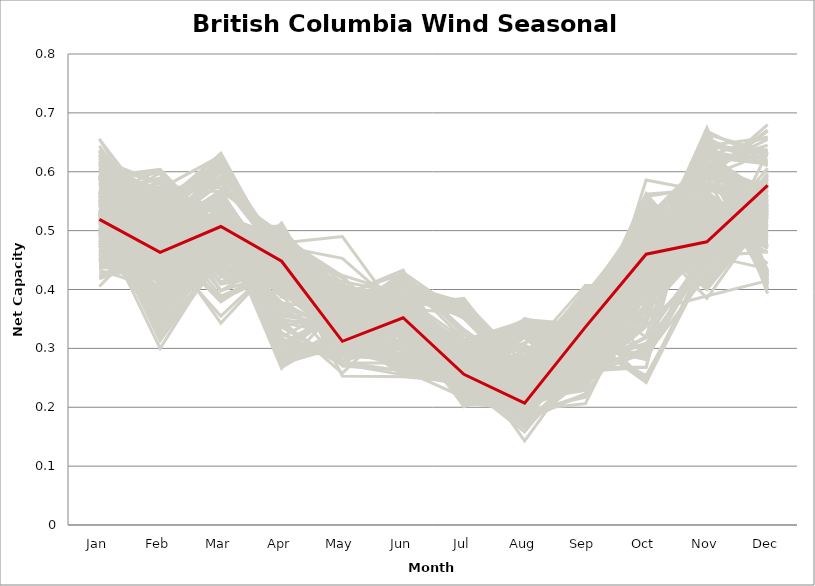
| Category | sample_001 | sample_002 | sample_003 | sample_004 | sample_005 | sample_006 | sample_007 | sample_008 | sample_009 | sample_011 | sample_012 | sample_013 | sample_014 | sample_015 | sample_016 | sample_017 | sample_018 | sample_019 | sample_020 | sample_021 | sample_022 | sample_023 | sample_024 | sample_025 | sample_026 | sample_027 | sample_028 | sample_029 | sample_030 | sample_031 | sample_032 | sample_033 | sample_034 | sample_035 | sample_036 | sample_037 | sample_038 | sample_039 | sample_040 | sample_041 | sample_042 | sample_043 | sample_044 | sample_045 | sample_046 | sample_047 | sample_048 | sample_049 | sample_050 | sample_051 | sample_052 | sample_053 | sample_054 | sample_055 | sample_056 | sample_057 | sample_058 | sample_059 | sample_060 | sample_061 | sample_062 | sample_063 | sample_064 | sample_065 | sample_066 | sample_067 | sample_068 | sample_069 | sample_070 | sample_071 | sample_072 | sample_073 | sample_074 | sample_075 | sample_076 | sample_077 | sample_078 | sample_079 | sample_080 | sample_081 | sample_082 | sample_083 | sample_084 | sample_085 | sample_086 | sample_087 | sample_088 | sample_089 | sample_090 | sample_091 | sample_092 | sample_093 | sample_094 | sample_095 | sample_096 | sample_097 | sample_098 | sample_099 | sample_100 | sample_101 | sample_102 | sample_103 | sample_104 | sample_105 | sample_106 | sample_107 | sample_108 | sample_109 | sample_110 | sample_111 | sample_112 | sample_113 | sample_114 | sample_115 | sample_116 | sample_117 | sample_118 | sample_119 | sample_120 | sample_121 | sample_122 | sample_123 | sample_124 | sample_125 | sample_126 | sample_127 | sample_128 | sample_129 | sample_130 | sample_131 | sample_132 | sample_133 | sample_134 | sample_135 | sample_136 | sample_137 | sample_138 | sample_139 | sample_140 | sample_141 | sample_142 | sample_143 | sample_144 | sample_145 | sample_146 | sample_147 | sample_148 | sample_149 | sample_150 | sample_151 | sample_152 | sample_153 | sample_154 | sample_155 | sample_156 | sample_157 | sample_158 | sample_159 | sample_160 | sample_161 | sample_162 | sample_163 | sample_164 | sample_165 | sample_166 | sample_167 | sample_168 | sample_169 | sample_170 | sample_171 | sample_172 | sample_173 | sample_174 | sample_175 | sample_176 | sample_177 | sample_178 | sample_179 | sample_180 | sample_181 | sample_182 | sample_183 | sample_184 | sample_185 | sample_186 | sample_187 | sample_188 | sample_189 | sample_190 | sample_191 | sample_192 | sample_193 | sample_194 | sample_195 | sample_196 | sample_197 | sample_198 | sample_199 | sample_200 | sample_201 | sample_202 | sample_203 | sample_204 | sample_205 | sample_206 | sample_207 | sample_208 | sample_209 | sample_210 | sample_211 | sample_212 | sample_213 | sample_214 | sample_215 | sample_216 | sample_217 | sample_218 | sample_219 | sample_220 | sample_221 | sample_222 | sample_223 | sample_224 | sample_225 | sample_226 | sample_227 | sample_228 | sample_229 | sample_230 | sample_231 | sample_232 | sample_233 | sample_234 | sample_235 | sample_236 | sample_237 | sample_238 | sample_239 | sample_240 | sample_241 | sample_242 | sample_243 | sample_244 | sample_245 | sample_246 | sample_247 | sample_248 | sample_249 | sample_250 | sample_010 |
|---|---|---|---|---|---|---|---|---|---|---|---|---|---|---|---|---|---|---|---|---|---|---|---|---|---|---|---|---|---|---|---|---|---|---|---|---|---|---|---|---|---|---|---|---|---|---|---|---|---|---|---|---|---|---|---|---|---|---|---|---|---|---|---|---|---|---|---|---|---|---|---|---|---|---|---|---|---|---|---|---|---|---|---|---|---|---|---|---|---|---|---|---|---|---|---|---|---|---|---|---|---|---|---|---|---|---|---|---|---|---|---|---|---|---|---|---|---|---|---|---|---|---|---|---|---|---|---|---|---|---|---|---|---|---|---|---|---|---|---|---|---|---|---|---|---|---|---|---|---|---|---|---|---|---|---|---|---|---|---|---|---|---|---|---|---|---|---|---|---|---|---|---|---|---|---|---|---|---|---|---|---|---|---|---|---|---|---|---|---|---|---|---|---|---|---|---|---|---|---|---|---|---|---|---|---|---|---|---|---|---|---|---|---|---|---|---|---|---|---|---|---|---|---|---|---|---|---|---|---|---|---|---|---|---|---|---|---|---|---|---|---|---|---|---|---|---|---|---|---|---|
| Jan | 0.554 | 0.494 | 0.623 | 0.591 | 0.539 | 0.604 | 0.5 | 0.48 | 0.591 | 0.61 | 0.526 | 0.535 | 0.635 | 0.526 | 0.48 | 0.451 | 0.53 | 0.499 | 0.587 | 0.446 | 0.519 | 0.479 | 0.552 | 0.553 | 0.448 | 0.593 | 0.613 | 0.479 | 0.612 | 0.441 | 0.626 | 0.496 | 0.509 | 0.467 | 0.522 | 0.497 | 0.475 | 0.42 | 0.447 | 0.581 | 0.564 | 0.59 | 0.565 | 0.655 | 0.505 | 0.522 | 0.455 | 0.516 | 0.438 | 0.52 | 0.517 | 0.595 | 0.529 | 0.542 | 0.488 | 0.488 | 0.611 | 0.595 | 0.632 | 0.494 | 0.46 | 0.51 | 0.612 | 0.516 | 0.515 | 0.509 | 0.551 | 0.475 | 0.547 | 0.512 | 0.515 | 0.59 | 0.524 | 0.458 | 0.629 | 0.535 | 0.6 | 0.6 | 0.441 | 0.568 | 0.588 | 0.567 | 0.475 | 0.59 | 0.596 | 0.519 | 0.588 | 0.53 | 0.611 | 0.593 | 0.523 | 0.492 | 0.474 | 0.556 | 0.621 | 0.542 | 0.506 | 0.533 | 0.449 | 0.5 | 0.523 | 0.6 | 0.628 | 0.582 | 0.593 | 0.527 | 0.461 | 0.498 | 0.5 | 0.502 | 0.502 | 0.486 | 0.454 | 0.557 | 0.436 | 0.637 | 0.578 | 0.628 | 0.504 | 0.618 | 0.454 | 0.552 | 0.484 | 0.506 | 0.465 | 0.567 | 0.44 | 0.517 | 0.536 | 0.518 | 0.527 | 0.514 | 0.545 | 0.571 | 0.552 | 0.532 | 0.538 | 0.427 | 0.533 | 0.461 | 0.422 | 0.578 | 0.501 | 0.554 | 0.545 | 0.568 | 0.505 | 0.656 | 0.546 | 0.486 | 0.503 | 0.636 | 0.437 | 0.567 | 0.542 | 0.49 | 0.585 | 0.567 | 0.582 | 0.468 | 0.45 | 0.549 | 0.524 | 0.594 | 0.498 | 0.603 | 0.483 | 0.485 | 0.54 | 0.503 | 0.454 | 0.469 | 0.615 | 0.441 | 0.505 | 0.567 | 0.607 | 0.447 | 0.433 | 0.479 | 0.438 | 0.461 | 0.544 | 0.405 | 0.587 | 0.605 | 0.548 | 0.565 | 0.597 | 0.448 | 0.472 | 0.613 | 0.558 | 0.528 | 0.489 | 0.567 | 0.478 | 0.532 | 0.47 | 0.423 | 0.495 | 0.595 | 0.602 | 0.535 | 0.572 | 0.509 | 0.56 | 0.56 | 0.567 | 0.56 | 0.447 | 0.459 | 0.438 | 0.575 | 0.42 | 0.619 | 0.483 | 0.514 | 0.502 | 0.644 | 0.545 | 0.468 | 0.558 | 0.535 | 0.545 | 0.526 | 0.565 | 0.535 | 0.471 | 0.566 | 0.521 | 0.518 | 0.604 | 0.588 | 0.466 | 0.586 | 0.556 | 0.418 | 0.492 | 0.462 | 0.527 | 0.564 | 0.616 | 0.448 | 0.53 | 0.541 | 0.578 | 0.487 | 0.63 | 0.519 |
| Feb | 0.433 | 0.448 | 0.484 | 0.423 | 0.584 | 0.53 | 0.336 | 0.518 | 0.604 | 0.544 | 0.361 | 0.436 | 0.47 | 0.543 | 0.367 | 0.543 | 0.41 | 0.519 | 0.521 | 0.432 | 0.337 | 0.348 | 0.464 | 0.467 | 0.462 | 0.462 | 0.555 | 0.372 | 0.547 | 0.459 | 0.538 | 0.434 | 0.478 | 0.425 | 0.36 | 0.374 | 0.374 | 0.479 | 0.574 | 0.462 | 0.557 | 0.421 | 0.36 | 0.521 | 0.327 | 0.552 | 0.523 | 0.394 | 0.425 | 0.343 | 0.324 | 0.519 | 0.599 | 0.368 | 0.558 | 0.553 | 0.581 | 0.556 | 0.554 | 0.347 | 0.385 | 0.362 | 0.55 | 0.55 | 0.481 | 0.496 | 0.386 | 0.387 | 0.582 | 0.442 | 0.523 | 0.47 | 0.407 | 0.445 | 0.538 | 0.408 | 0.555 | 0.596 | 0.455 | 0.508 | 0.572 | 0.42 | 0.543 | 0.496 | 0.572 | 0.44 | 0.408 | 0.5 | 0.458 | 0.521 | 0.375 | 0.401 | 0.364 | 0.603 | 0.581 | 0.51 | 0.432 | 0.575 | 0.405 | 0.472 | 0.517 | 0.507 | 0.477 | 0.502 | 0.491 | 0.313 | 0.413 | 0.419 | 0.541 | 0.541 | 0.518 | 0.5 | 0.516 | 0.385 | 0.449 | 0.547 | 0.499 | 0.515 | 0.493 | 0.512 | 0.392 | 0.39 | 0.435 | 0.392 | 0.365 | 0.546 | 0.424 | 0.438 | 0.467 | 0.536 | 0.43 | 0.509 | 0.463 | 0.457 | 0.525 | 0.341 | 0.567 | 0.451 | 0.449 | 0.402 | 0.473 | 0.505 | 0.571 | 0.432 | 0.452 | 0.494 | 0.498 | 0.484 | 0.328 | 0.378 | 0.341 | 0.489 | 0.458 | 0.504 | 0.521 | 0.422 | 0.545 | 0.496 | 0.513 | 0.391 | 0.567 | 0.442 | 0.573 | 0.488 | 0.363 | 0.499 | 0.354 | 0.377 | 0.539 | 0.398 | 0.415 | 0.444 | 0.5 | 0.482 | 0.394 | 0.494 | 0.51 | 0.437 | 0.4 | 0.356 | 0.456 | 0.426 | 0.484 | 0.51 | 0.51 | 0.466 | 0.383 | 0.48 | 0.503 | 0.528 | 0.546 | 0.551 | 0.543 | 0.385 | 0.367 | 0.379 | 0.372 | 0.336 | 0.449 | 0.457 | 0.357 | 0.49 | 0.529 | 0.358 | 0.529 | 0.488 | 0.375 | 0.483 | 0.589 | 0.384 | 0.404 | 0.56 | 0.436 | 0.521 | 0.444 | 0.52 | 0.361 | 0.3 | 0.569 | 0.488 | 0.535 | 0.379 | 0.479 | 0.546 | 0.55 | 0.491 | 0.514 | 0.581 | 0.562 | 0.491 | 0.429 | 0.421 | 0.557 | 0.518 | 0.528 | 0.482 | 0.589 | 0.456 | 0.517 | 0.532 | 0.487 | 0.383 | 0.469 | 0.424 | 0.316 | 0.505 | 0.514 | 0.447 | 0.539 | 0.463 |
| Mar | 0.493 | 0.508 | 0.385 | 0.48 | 0.431 | 0.511 | 0.478 | 0.621 | 0.496 | 0.421 | 0.472 | 0.49 | 0.355 | 0.631 | 0.504 | 0.55 | 0.48 | 0.627 | 0.455 | 0.521 | 0.469 | 0.515 | 0.629 | 0.602 | 0.464 | 0.5 | 0.514 | 0.512 | 0.411 | 0.506 | 0.521 | 0.446 | 0.489 | 0.528 | 0.48 | 0.486 | 0.525 | 0.441 | 0.573 | 0.506 | 0.495 | 0.495 | 0.52 | 0.398 | 0.476 | 0.617 | 0.585 | 0.515 | 0.543 | 0.457 | 0.457 | 0.538 | 0.441 | 0.518 | 0.582 | 0.587 | 0.435 | 0.51 | 0.543 | 0.493 | 0.485 | 0.474 | 0.46 | 0.398 | 0.487 | 0.494 | 0.511 | 0.486 | 0.434 | 0.489 | 0.427 | 0.518 | 0.515 | 0.556 | 0.412 | 0.53 | 0.488 | 0.499 | 0.499 | 0.604 | 0.48 | 0.478 | 0.617 | 0.551 | 0.527 | 0.544 | 0.48 | 0.482 | 0.552 | 0.517 | 0.462 | 0.494 | 0.466 | 0.453 | 0.456 | 0.592 | 0.524 | 0.438 | 0.538 | 0.502 | 0.465 | 0.427 | 0.567 | 0.503 | 0.491 | 0.461 | 0.54 | 0.461 | 0.598 | 0.435 | 0.619 | 0.581 | 0.613 | 0.481 | 0.494 | 0.538 | 0.515 | 0.562 | 0.469 | 0.413 | 0.543 | 0.526 | 0.507 | 0.47 | 0.497 | 0.467 | 0.532 | 0.491 | 0.495 | 0.631 | 0.538 | 0.489 | 0.616 | 0.514 | 0.494 | 0.467 | 0.454 | 0.486 | 0.489 | 0.536 | 0.452 | 0.488 | 0.627 | 0.477 | 0.507 | 0.507 | 0.482 | 0.379 | 0.454 | 0.504 | 0.478 | 0.383 | 0.452 | 0.6 | 0.467 | 0.433 | 0.492 | 0.491 | 0.5 | 0.497 | 0.567 | 0.484 | 0.44 | 0.56 | 0.51 | 0.559 | 0.496 | 0.514 | 0.607 | 0.52 | 0.543 | 0.528 | 0.568 | 0.489 | 0.497 | 0.516 | 0.389 | 0.543 | 0.552 | 0.464 | 0.517 | 0.525 | 0.482 | 0.498 | 0.495 | 0.56 | 0.48 | 0.495 | 0.531 | 0.556 | 0.519 | 0.437 | 0.41 | 0.5 | 0.454 | 0.5 | 0.49 | 0.465 | 0.508 | 0.508 | 0.498 | 0.568 | 0.501 | 0.51 | 0.493 | 0.483 | 0.473 | 0.624 | 0.479 | 0.466 | 0.541 | 0.454 | 0.516 | 0.496 | 0.445 | 0.527 | 0.509 | 0.463 | 0.435 | 0.343 | 0.426 | 0.492 | 0.517 | 0.426 | 0.458 | 0.478 | 0.512 | 0.434 | 0.441 | 0.503 | 0.507 | 0.535 | 0.461 | 0.504 | 0.548 | 0.513 | 0.437 | 0.501 | 0.619 | 0.614 | 0.475 | 0.516 | 0.565 | 0.495 | 0.449 | 0.58 | 0.51 | 0.544 | 0.409 | 0.507 |
| Apr | 0.414 | 0.299 | 0.444 | 0.433 | 0.423 | 0.466 | 0.481 | 0.43 | 0.398 | 0.423 | 0.497 | 0.397 | 0.452 | 0.445 | 0.508 | 0.344 | 0.425 | 0.445 | 0.403 | 0.306 | 0.489 | 0.473 | 0.441 | 0.447 | 0.425 | 0.462 | 0.404 | 0.489 | 0.433 | 0.327 | 0.446 | 0.479 | 0.43 | 0.291 | 0.48 | 0.508 | 0.489 | 0.468 | 0.484 | 0.458 | 0.398 | 0.429 | 0.303 | 0.43 | 0.483 | 0.448 | 0.46 | 0.432 | 0.275 | 0.492 | 0.49 | 0.417 | 0.428 | 0.336 | 0.482 | 0.453 | 0.4 | 0.393 | 0.436 | 0.489 | 0.378 | 0.506 | 0.415 | 0.455 | 0.446 | 0.442 | 0.291 | 0.372 | 0.435 | 0.411 | 0.391 | 0.444 | 0.397 | 0.279 | 0.424 | 0.411 | 0.42 | 0.387 | 0.336 | 0.46 | 0.409 | 0.437 | 0.436 | 0.396 | 0.397 | 0.418 | 0.442 | 0.44 | 0.428 | 0.455 | 0.485 | 0.498 | 0.495 | 0.425 | 0.394 | 0.479 | 0.398 | 0.42 | 0.281 | 0.446 | 0.465 | 0.426 | 0.398 | 0.45 | 0.456 | 0.494 | 0.289 | 0.473 | 0.47 | 0.449 | 0.461 | 0.45 | 0.452 | 0.43 | 0.324 | 0.432 | 0.458 | 0.424 | 0.457 | 0.437 | 0.28 | 0.301 | 0.3 | 0.5 | 0.496 | 0.424 | 0.27 | 0.413 | 0.445 | 0.443 | 0.395 | 0.455 | 0.454 | 0.439 | 0.411 | 0.491 | 0.465 | 0.347 | 0.453 | 0.285 | 0.457 | 0.461 | 0.434 | 0.408 | 0.473 | 0.445 | 0.462 | 0.447 | 0.496 | 0.497 | 0.477 | 0.43 | 0.442 | 0.475 | 0.455 | 0.431 | 0.406 | 0.446 | 0.446 | 0.355 | 0.495 | 0.407 | 0.416 | 0.408 | 0.476 | 0.399 | 0.489 | 0.493 | 0.469 | 0.414 | 0.278 | 0.302 | 0.404 | 0.341 | 0.417 | 0.431 | 0.43 | 0.289 | 0.268 | 0.507 | 0.309 | 0.292 | 0.455 | 0.455 | 0.467 | 0.41 | 0.426 | 0.457 | 0.421 | 0.36 | 0.366 | 0.404 | 0.513 | 0.347 | 0.496 | 0.319 | 0.496 | 0.499 | 0.49 | 0.311 | 0.496 | 0.388 | 0.46 | 0.266 | 0.415 | 0.444 | 0.428 | 0.453 | 0.409 | 0.436 | 0.274 | 0.425 | 0.304 | 0.453 | 0.454 | 0.442 | 0.485 | 0.492 | 0.465 | 0.454 | 0.416 | 0.369 | 0.461 | 0.411 | 0.442 | 0.464 | 0.442 | 0.412 | 0.429 | 0.44 | 0.432 | 0.395 | 0.377 | 0.457 | 0.35 | 0.441 | 0.429 | 0.316 | 0.436 | 0.442 | 0.465 | 0.308 | 0.418 | 0.411 | 0.505 | 0.477 | 0.456 | 0.294 | 0.427 | 0.448 |
| May | 0.374 | 0.293 | 0.307 | 0.31 | 0.352 | 0.349 | 0.351 | 0.359 | 0.385 | 0.314 | 0.344 | 0.371 | 0.311 | 0.372 | 0.3 | 0.323 | 0.308 | 0.367 | 0.324 | 0.292 | 0.353 | 0.317 | 0.397 | 0.402 | 0.295 | 0.401 | 0.372 | 0.322 | 0.313 | 0.272 | 0.353 | 0.49 | 0.386 | 0.296 | 0.331 | 0.312 | 0.312 | 0.309 | 0.334 | 0.4 | 0.369 | 0.329 | 0.361 | 0.306 | 0.355 | 0.367 | 0.337 | 0.314 | 0.323 | 0.348 | 0.352 | 0.346 | 0.357 | 0.366 | 0.325 | 0.334 | 0.352 | 0.371 | 0.391 | 0.423 | 0.325 | 0.33 | 0.359 | 0.253 | 0.378 | 0.311 | 0.368 | 0.332 | 0.355 | 0.368 | 0.27 | 0.398 | 0.312 | 0.324 | 0.309 | 0.318 | 0.364 | 0.391 | 0.276 | 0.39 | 0.366 | 0.301 | 0.368 | 0.343 | 0.365 | 0.314 | 0.307 | 0.388 | 0.362 | 0.393 | 0.348 | 0.314 | 0.335 | 0.352 | 0.362 | 0.381 | 0.315 | 0.367 | 0.325 | 0.318 | 0.319 | 0.324 | 0.368 | 0.413 | 0.406 | 0.383 | 0.304 | 0.453 | 0.316 | 0.276 | 0.37 | 0.326 | 0.348 | 0.309 | 0.279 | 0.39 | 0.424 | 0.358 | 0.375 | 0.319 | 0.315 | 0.369 | 0.291 | 0.327 | 0.3 | 0.348 | 0.322 | 0.37 | 0.357 | 0.371 | 0.318 | 0.332 | 0.398 | 0.406 | 0.355 | 0.339 | 0.346 | 0.258 | 0.372 | 0.302 | 0.311 | 0.393 | 0.358 | 0.369 | 0.337 | 0.375 | 0.377 | 0.326 | 0.402 | 0.313 | 0.345 | 0.312 | 0.3 | 0.375 | 0.321 | 0.299 | 0.378 | 0.371 | 0.335 | 0.34 | 0.326 | 0.378 | 0.368 | 0.343 | 0.322 | 0.352 | 0.311 | 0.297 | 0.364 | 0.32 | 0.336 | 0.3 | 0.363 | 0.274 | 0.309 | 0.356 | 0.305 | 0.314 | 0.327 | 0.323 | 0.296 | 0.298 | 0.383 | 0.308 | 0.396 | 0.366 | 0.309 | 0.383 | 0.344 | 0.331 | 0.319 | 0.348 | 0.334 | 0.344 | 0.324 | 0.375 | 0.305 | 0.392 | 0.322 | 0.294 | 0.411 | 0.356 | 0.346 | 0.376 | 0.367 | 0.378 | 0.307 | 0.389 | 0.406 | 0.32 | 0.304 | 0.288 | 0.297 | 0.378 | 0.319 | 0.352 | 0.419 | 0.378 | 0.273 | 0.285 | 0.374 | 0.334 | 0.394 | 0.378 | 0.354 | 0.395 | 0.356 | 0.342 | 0.275 | 0.341 | 0.316 | 0.313 | 0.365 | 0.398 | 0.327 | 0.394 | 0.363 | 0.288 | 0.358 | 0.355 | 0.381 | 0.366 | 0.364 | 0.297 | 0.384 | 0.377 | 0.38 | 0.289 | 0.311 | 0.312 |
| Jun | 0.357 | 0.276 | 0.297 | 0.349 | 0.363 | 0.426 | 0.338 | 0.354 | 0.393 | 0.305 | 0.34 | 0.336 | 0.271 | 0.366 | 0.327 | 0.289 | 0.347 | 0.355 | 0.308 | 0.283 | 0.347 | 0.329 | 0.368 | 0.361 | 0.388 | 0.368 | 0.411 | 0.329 | 0.302 | 0.345 | 0.424 | 0.348 | 0.328 | 0.279 | 0.329 | 0.335 | 0.331 | 0.373 | 0.321 | 0.386 | 0.383 | 0.352 | 0.351 | 0.297 | 0.346 | 0.356 | 0.363 | 0.349 | 0.261 | 0.365 | 0.348 | 0.408 | 0.367 | 0.351 | 0.355 | 0.372 | 0.329 | 0.399 | 0.427 | 0.317 | 0.347 | 0.325 | 0.323 | 0.252 | 0.326 | 0.341 | 0.358 | 0.353 | 0.365 | 0.34 | 0.263 | 0.384 | 0.361 | 0.271 | 0.302 | 0.352 | 0.399 | 0.397 | 0.342 | 0.363 | 0.389 | 0.344 | 0.349 | 0.419 | 0.408 | 0.343 | 0.339 | 0.333 | 0.4 | 0.372 | 0.339 | 0.345 | 0.335 | 0.377 | 0.325 | 0.347 | 0.37 | 0.348 | 0.263 | 0.332 | 0.35 | 0.297 | 0.421 | 0.394 | 0.384 | 0.35 | 0.276 | 0.363 | 0.373 | 0.262 | 0.343 | 0.358 | 0.362 | 0.339 | 0.305 | 0.433 | 0.392 | 0.415 | 0.321 | 0.297 | 0.278 | 0.361 | 0.277 | 0.339 | 0.343 | 0.386 | 0.255 | 0.336 | 0.344 | 0.366 | 0.342 | 0.334 | 0.351 | 0.387 | 0.328 | 0.334 | 0.327 | 0.357 | 0.344 | 0.279 | 0.38 | 0.396 | 0.371 | 0.338 | 0.334 | 0.414 | 0.317 | 0.268 | 0.343 | 0.332 | 0.34 | 0.279 | 0.388 | 0.362 | 0.35 | 0.268 | 0.388 | 0.408 | 0.429 | 0.357 | 0.327 | 0.34 | 0.352 | 0.406 | 0.327 | 0.416 | 0.344 | 0.343 | 0.356 | 0.334 | 0.255 | 0.298 | 0.386 | 0.376 | 0.353 | 0.416 | 0.278 | 0.287 | 0.258 | 0.333 | 0.329 | 0.278 | 0.305 | 0.34 | 0.385 | 0.393 | 0.333 | 0.391 | 0.396 | 0.306 | 0.284 | 0.308 | 0.338 | 0.353 | 0.339 | 0.35 | 0.329 | 0.351 | 0.32 | 0.316 | 0.319 | 0.42 | 0.418 | 0.354 | 0.383 | 0.329 | 0.342 | 0.38 | 0.381 | 0.336 | 0.271 | 0.28 | 0.282 | 0.417 | 0.383 | 0.423 | 0.324 | 0.35 | 0.255 | 0.288 | 0.346 | 0.36 | 0.406 | 0.357 | 0.366 | 0.313 | 0.429 | 0.357 | 0.275 | 0.324 | 0.335 | 0.356 | 0.327 | 0.395 | 0.301 | 0.386 | 0.371 | 0.327 | 0.349 | 0.364 | 0.32 | 0.366 | 0.408 | 0.348 | 0.338 | 0.349 | 0.409 | 0.292 | 0.311 | 0.352 |
| Jul | 0.261 | 0.232 | 0.255 | 0.214 | 0.282 | 0.332 | 0.27 | 0.222 | 0.276 | 0.246 | 0.263 | 0.203 | 0.276 | 0.223 | 0.212 | 0.239 | 0.201 | 0.229 | 0.237 | 0.259 | 0.263 | 0.234 | 0.214 | 0.239 | 0.302 | 0.359 | 0.272 | 0.247 | 0.26 | 0.23 | 0.217 | 0.301 | 0.214 | 0.236 | 0.253 | 0.232 | 0.228 | 0.307 | 0.226 | 0.378 | 0.277 | 0.209 | 0.269 | 0.256 | 0.26 | 0.225 | 0.23 | 0.222 | 0.237 | 0.265 | 0.266 | 0.21 | 0.302 | 0.308 | 0.231 | 0.23 | 0.222 | 0.265 | 0.239 | 0.288 | 0.312 | 0.251 | 0.223 | 0.243 | 0.269 | 0.272 | 0.284 | 0.313 | 0.314 | 0.206 | 0.217 | 0.358 | 0.219 | 0.24 | 0.245 | 0.231 | 0.291 | 0.278 | 0.233 | 0.21 | 0.27 | 0.214 | 0.234 | 0.21 | 0.264 | 0.245 | 0.215 | 0.228 | 0.227 | 0.385 | 0.269 | 0.23 | 0.253 | 0.306 | 0.218 | 0.224 | 0.21 | 0.281 | 0.255 | 0.256 | 0.253 | 0.235 | 0.22 | 0.369 | 0.377 | 0.275 | 0.239 | 0.287 | 0.233 | 0.246 | 0.232 | 0.245 | 0.218 | 0.225 | 0.243 | 0.242 | 0.357 | 0.208 | 0.251 | 0.253 | 0.25 | 0.287 | 0.24 | 0.255 | 0.22 | 0.29 | 0.256 | 0.206 | 0.209 | 0.224 | 0.235 | 0.255 | 0.228 | 0.364 | 0.27 | 0.268 | 0.295 | 0.231 | 0.213 | 0.239 | 0.309 | 0.381 | 0.226 | 0.206 | 0.288 | 0.351 | 0.238 | 0.279 | 0.3 | 0.226 | 0.264 | 0.268 | 0.315 | 0.216 | 0.252 | 0.245 | 0.278 | 0.365 | 0.322 | 0.315 | 0.234 | 0.218 | 0.314 | 0.209 | 0.229 | 0.212 | 0.22 | 0.205 | 0.229 | 0.216 | 0.239 | 0.249 | 0.22 | 0.237 | 0.216 | 0.328 | 0.267 | 0.249 | 0.243 | 0.25 | 0.236 | 0.24 | 0.261 | 0.235 | 0.38 | 0.224 | 0.226 | 0.366 | 0.203 | 0.237 | 0.239 | 0.228 | 0.294 | 0.3 | 0.258 | 0.292 | 0.216 | 0.295 | 0.263 | 0.227 | 0.299 | 0.214 | 0.315 | 0.286 | 0.3 | 0.229 | 0.226 | 0.212 | 0.295 | 0.217 | 0.246 | 0.239 | 0.26 | 0.368 | 0.307 | 0.225 | 0.288 | 0.275 | 0.247 | 0.278 | 0.291 | 0.315 | 0.372 | 0.307 | 0.304 | 0.283 | 0.357 | 0.298 | 0.242 | 0.26 | 0.249 | 0.238 | 0.212 | 0.352 | 0.253 | 0.375 | 0.293 | 0.242 | 0.218 | 0.222 | 0.238 | 0.278 | 0.222 | 0.209 | 0.288 | 0.23 | 0.378 | 0.243 | 0.262 | 0.256 |
| Aug | 0.239 | 0.287 | 0.233 | 0.222 | 0.336 | 0.259 | 0.289 | 0.275 | 0.285 | 0.236 | 0.278 | 0.226 | 0.21 | 0.256 | 0.332 | 0.168 | 0.24 | 0.272 | 0.261 | 0.237 | 0.268 | 0.34 | 0.277 | 0.266 | 0.22 | 0.237 | 0.32 | 0.344 | 0.238 | 0.191 | 0.193 | 0.264 | 0.241 | 0.277 | 0.269 | 0.319 | 0.328 | 0.225 | 0.269 | 0.239 | 0.326 | 0.226 | 0.231 | 0.222 | 0.283 | 0.261 | 0.263 | 0.211 | 0.246 | 0.265 | 0.285 | 0.21 | 0.327 | 0.243 | 0.267 | 0.248 | 0.236 | 0.28 | 0.178 | 0.259 | 0.247 | 0.296 | 0.253 | 0.182 | 0.23 | 0.201 | 0.224 | 0.248 | 0.334 | 0.228 | 0.186 | 0.241 | 0.211 | 0.231 | 0.229 | 0.214 | 0.336 | 0.275 | 0.192 | 0.263 | 0.279 | 0.233 | 0.269 | 0.212 | 0.302 | 0.212 | 0.236 | 0.226 | 0.208 | 0.253 | 0.282 | 0.327 | 0.31 | 0.318 | 0.252 | 0.258 | 0.202 | 0.348 | 0.249 | 0.199 | 0.231 | 0.251 | 0.211 | 0.244 | 0.244 | 0.248 | 0.284 | 0.262 | 0.257 | 0.18 | 0.258 | 0.265 | 0.27 | 0.244 | 0.223 | 0.186 | 0.249 | 0.195 | 0.233 | 0.241 | 0.267 | 0.244 | 0.273 | 0.288 | 0.335 | 0.327 | 0.228 | 0.228 | 0.226 | 0.264 | 0.202 | 0.248 | 0.269 | 0.252 | 0.206 | 0.273 | 0.232 | 0.199 | 0.233 | 0.29 | 0.22 | 0.243 | 0.276 | 0.217 | 0.143 | 0.246 | 0.218 | 0.229 | 0.231 | 0.342 | 0.285 | 0.229 | 0.225 | 0.269 | 0.228 | 0.225 | 0.348 | 0.254 | 0.273 | 0.244 | 0.268 | 0.228 | 0.346 | 0.204 | 0.351 | 0.206 | 0.349 | 0.332 | 0.265 | 0.205 | 0.247 | 0.226 | 0.202 | 0.2 | 0.214 | 0.263 | 0.234 | 0.233 | 0.235 | 0.296 | 0.205 | 0.283 | 0.22 | 0.206 | 0.273 | 0.206 | 0.252 | 0.241 | 0.214 | 0.168 | 0.165 | 0.252 | 0.25 | 0.239 | 0.309 | 0.248 | 0.329 | 0.242 | 0.173 | 0.202 | 0.284 | 0.212 | 0.258 | 0.253 | 0.349 | 0.215 | 0.25 | 0.271 | 0.297 | 0.231 | 0.263 | 0.158 | 0.223 | 0.247 | 0.224 | 0.199 | 0.265 | 0.27 | 0.179 | 0.211 | 0.347 | 0.263 | 0.253 | 0.344 | 0.323 | 0.226 | 0.263 | 0.306 | 0.175 | 0.23 | 0.201 | 0.215 | 0.266 | 0.257 | 0.173 | 0.229 | 0.33 | 0.195 | 0.27 | 0.278 | 0.23 | 0.232 | 0.211 | 0.205 | 0.243 | 0.263 | 0.248 | 0.28 | 0.237 | 0.207 |
| Sep | 0.323 | 0.294 | 0.245 | 0.361 | 0.268 | 0.398 | 0.407 | 0.34 | 0.289 | 0.236 | 0.373 | 0.369 | 0.268 | 0.312 | 0.34 | 0.276 | 0.368 | 0.308 | 0.277 | 0.344 | 0.383 | 0.346 | 0.267 | 0.262 | 0.289 | 0.359 | 0.258 | 0.329 | 0.26 | 0.405 | 0.217 | 0.279 | 0.304 | 0.279 | 0.368 | 0.343 | 0.333 | 0.264 | 0.379 | 0.388 | 0.234 | 0.375 | 0.325 | 0.247 | 0.395 | 0.306 | 0.392 | 0.343 | 0.333 | 0.377 | 0.392 | 0.239 | 0.253 | 0.3 | 0.357 | 0.383 | 0.259 | 0.254 | 0.223 | 0.266 | 0.301 | 0.348 | 0.268 | 0.361 | 0.287 | 0.329 | 0.307 | 0.286 | 0.258 | 0.345 | 0.404 | 0.38 | 0.328 | 0.358 | 0.247 | 0.342 | 0.231 | 0.295 | 0.397 | 0.283 | 0.287 | 0.346 | 0.359 | 0.243 | 0.271 | 0.35 | 0.356 | 0.299 | 0.253 | 0.29 | 0.365 | 0.341 | 0.35 | 0.234 | 0.261 | 0.299 | 0.327 | 0.273 | 0.335 | 0.327 | 0.318 | 0.256 | 0.232 | 0.351 | 0.347 | 0.346 | 0.282 | 0.276 | 0.386 | 0.303 | 0.303 | 0.374 | 0.371 | 0.37 | 0.379 | 0.222 | 0.37 | 0.206 | 0.297 | 0.258 | 0.315 | 0.308 | 0.303 | 0.353 | 0.349 | 0.238 | 0.356 | 0.345 | 0.331 | 0.302 | 0.349 | 0.308 | 0.274 | 0.371 | 0.313 | 0.38 | 0.293 | 0.4 | 0.324 | 0.294 | 0.287 | 0.38 | 0.359 | 0.366 | 0.285 | 0.396 | 0.279 | 0.251 | 0.35 | 0.345 | 0.358 | 0.242 | 0.279 | 0.282 | 0.316 | 0.39 | 0.228 | 0.403 | 0.4 | 0.301 | 0.388 | 0.364 | 0.243 | 0.235 | 0.322 | 0.232 | 0.34 | 0.344 | 0.3 | 0.33 | 0.329 | 0.342 | 0.238 | 0.406 | 0.34 | 0.37 | 0.254 | 0.342 | 0.352 | 0.361 | 0.381 | 0.287 | 0.288 | 0.289 | 0.312 | 0.247 | 0.379 | 0.39 | 0.229 | 0.25 | 0.261 | 0.264 | 0.306 | 0.294 | 0.354 | 0.309 | 0.341 | 0.342 | 0.313 | 0.368 | 0.256 | 0.241 | 0.381 | 0.34 | 0.235 | 0.293 | 0.355 | 0.272 | 0.304 | 0.372 | 0.316 | 0.284 | 0.363 | 0.397 | 0.278 | 0.242 | 0.282 | 0.362 | 0.311 | 0.258 | 0.276 | 0.297 | 0.394 | 0.264 | 0.237 | 0.285 | 0.383 | 0.245 | 0.31 | 0.346 | 0.346 | 0.347 | 0.255 | 0.319 | 0.266 | 0.384 | 0.275 | 0.393 | 0.343 | 0.371 | 0.297 | 0.31 | 0.229 | 0.327 | 0.369 | 0.304 | 0.389 | 0.28 | 0.26 | 0.336 |
| Oct | 0.362 | 0.511 | 0.394 | 0.482 | 0.455 | 0.464 | 0.408 | 0.521 | 0.41 | 0.348 | 0.413 | 0.459 | 0.459 | 0.516 | 0.495 | 0.309 | 0.52 | 0.526 | 0.362 | 0.415 | 0.401 | 0.515 | 0.546 | 0.544 | 0.455 | 0.404 | 0.418 | 0.5 | 0.342 | 0.375 | 0.391 | 0.491 | 0.449 | 0.504 | 0.421 | 0.476 | 0.498 | 0.458 | 0.511 | 0.416 | 0.434 | 0.464 | 0.557 | 0.366 | 0.401 | 0.521 | 0.519 | 0.515 | 0.479 | 0.4 | 0.402 | 0.435 | 0.447 | 0.521 | 0.51 | 0.507 | 0.299 | 0.412 | 0.362 | 0.562 | 0.499 | 0.435 | 0.268 | 0.291 | 0.41 | 0.46 | 0.53 | 0.497 | 0.458 | 0.445 | 0.288 | 0.421 | 0.51 | 0.448 | 0.343 | 0.506 | 0.419 | 0.402 | 0.375 | 0.525 | 0.407 | 0.502 | 0.496 | 0.443 | 0.431 | 0.504 | 0.515 | 0.403 | 0.431 | 0.465 | 0.412 | 0.485 | 0.467 | 0.451 | 0.268 | 0.521 | 0.501 | 0.466 | 0.465 | 0.456 | 0.248 | 0.376 | 0.412 | 0.43 | 0.412 | 0.435 | 0.509 | 0.494 | 0.532 | 0.281 | 0.516 | 0.521 | 0.507 | 0.518 | 0.395 | 0.371 | 0.434 | 0.414 | 0.402 | 0.353 | 0.491 | 0.551 | 0.493 | 0.454 | 0.506 | 0.454 | 0.436 | 0.435 | 0.413 | 0.532 | 0.498 | 0.254 | 0.555 | 0.421 | 0.283 | 0.403 | 0.303 | 0.373 | 0.447 | 0.508 | 0.469 | 0.398 | 0.497 | 0.454 | 0.47 | 0.434 | 0.421 | 0.442 | 0.426 | 0.499 | 0.435 | 0.407 | 0.463 | 0.538 | 0.242 | 0.319 | 0.437 | 0.43 | 0.459 | 0.49 | 0.516 | 0.452 | 0.483 | 0.433 | 0.517 | 0.426 | 0.498 | 0.491 | 0.547 | 0.509 | 0.458 | 0.4 | 0.399 | 0.345 | 0.512 | 0.444 | 0.368 | 0.442 | 0.472 | 0.461 | 0.401 | 0.498 | 0.4 | 0.512 | 0.433 | 0.415 | 0.514 | 0.433 | 0.465 | 0.337 | 0.301 | 0.32 | 0.285 | 0.492 | 0.46 | 0.545 | 0.49 | 0.444 | 0.501 | 0.385 | 0.586 | 0.421 | 0.448 | 0.563 | 0.464 | 0.41 | 0.52 | 0.537 | 0.415 | 0.489 | 0.505 | 0.305 | 0.407 | 0.421 | 0.494 | 0.395 | 0.558 | 0.443 | 0.281 | 0.489 | 0.452 | 0.505 | 0.43 | 0.475 | 0.467 | 0.391 | 0.437 | 0.452 | 0.289 | 0.243 | 0.5 | 0.493 | 0.293 | 0.431 | 0.318 | 0.404 | 0.455 | 0.379 | 0.508 | 0.505 | 0.422 | 0.544 | 0.435 | 0.49 | 0.423 | 0.514 | 0.409 | 0.5 | 0.343 | 0.46 |
| Nov | 0.389 | 0.513 | 0.613 | 0.648 | 0.532 | 0.611 | 0.475 | 0.473 | 0.53 | 0.622 | 0.461 | 0.618 | 0.59 | 0.492 | 0.385 | 0.445 | 0.59 | 0.47 | 0.625 | 0.515 | 0.451 | 0.43 | 0.488 | 0.487 | 0.536 | 0.602 | 0.556 | 0.418 | 0.642 | 0.514 | 0.481 | 0.592 | 0.65 | 0.504 | 0.477 | 0.41 | 0.415 | 0.509 | 0.488 | 0.617 | 0.547 | 0.638 | 0.463 | 0.644 | 0.461 | 0.487 | 0.47 | 0.517 | 0.485 | 0.472 | 0.47 | 0.527 | 0.543 | 0.443 | 0.489 | 0.485 | 0.647 | 0.546 | 0.475 | 0.57 | 0.469 | 0.451 | 0.657 | 0.474 | 0.656 | 0.484 | 0.464 | 0.458 | 0.549 | 0.657 | 0.426 | 0.631 | 0.553 | 0.512 | 0.646 | 0.519 | 0.548 | 0.539 | 0.518 | 0.495 | 0.535 | 0.618 | 0.467 | 0.517 | 0.55 | 0.5 | 0.622 | 0.648 | 0.483 | 0.569 | 0.478 | 0.441 | 0.445 | 0.559 | 0.663 | 0.482 | 0.562 | 0.536 | 0.487 | 0.473 | 0.457 | 0.592 | 0.477 | 0.602 | 0.598 | 0.465 | 0.501 | 0.589 | 0.503 | 0.477 | 0.474 | 0.502 | 0.465 | 0.611 | 0.536 | 0.479 | 0.6 | 0.48 | 0.65 | 0.637 | 0.506 | 0.456 | 0.522 | 0.455 | 0.402 | 0.566 | 0.497 | 0.671 | 0.646 | 0.473 | 0.492 | 0.441 | 0.482 | 0.611 | 0.458 | 0.462 | 0.456 | 0.493 | 0.674 | 0.493 | 0.515 | 0.626 | 0.478 | 0.622 | 0.478 | 0.598 | 0.656 | 0.594 | 0.466 | 0.422 | 0.457 | 0.605 | 0.525 | 0.521 | 0.461 | 0.465 | 0.56 | 0.611 | 0.628 | 0.462 | 0.468 | 0.623 | 0.549 | 0.51 | 0.427 | 0.508 | 0.427 | 0.406 | 0.51 | 0.518 | 0.494 | 0.519 | 0.507 | 0.505 | 0.599 | 0.632 | 0.627 | 0.506 | 0.493 | 0.435 | 0.529 | 0.512 | 0.65 | 0.462 | 0.577 | 0.501 | 0.621 | 0.611 | 0.528 | 0.444 | 0.454 | 0.629 | 0.458 | 0.47 | 0.45 | 0.463 | 0.4 | 0.445 | 0.475 | 0.521 | 0.566 | 0.515 | 0.609 | 0.44 | 0.557 | 0.655 | 0.624 | 0.499 | 0.53 | 0.611 | 0.51 | 0.45 | 0.52 | 0.607 | 0.538 | 0.481 | 0.574 | 0.454 | 0.474 | 0.59 | 0.529 | 0.481 | 0.616 | 0.561 | 0.557 | 0.663 | 0.615 | 0.538 | 0.48 | 0.444 | 0.486 | 0.504 | 0.669 | 0.581 | 0.463 | 0.616 | 0.542 | 0.506 | 0.459 | 0.467 | 0.674 | 0.464 | 0.491 | 0.59 | 0.469 | 0.495 | 0.599 | 0.512 | 0.647 | 0.481 |
| Dec | 0.415 | 0.477 | 0.645 | 0.43 | 0.513 | 0.568 | 0.541 | 0.546 | 0.489 | 0.637 | 0.545 | 0.415 | 0.669 | 0.538 | 0.53 | 0.523 | 0.409 | 0.519 | 0.613 | 0.548 | 0.542 | 0.524 | 0.503 | 0.501 | 0.499 | 0.535 | 0.49 | 0.535 | 0.637 | 0.559 | 0.539 | 0.556 | 0.417 | 0.472 | 0.558 | 0.512 | 0.53 | 0.475 | 0.581 | 0.536 | 0.484 | 0.428 | 0.597 | 0.658 | 0.54 | 0.525 | 0.545 | 0.531 | 0.535 | 0.549 | 0.545 | 0.462 | 0.495 | 0.554 | 0.579 | 0.544 | 0.63 | 0.49 | 0.535 | 0.561 | 0.533 | 0.517 | 0.61 | 0.593 | 0.424 | 0.606 | 0.578 | 0.539 | 0.505 | 0.401 | 0.633 | 0.54 | 0.507 | 0.535 | 0.619 | 0.528 | 0.475 | 0.483 | 0.558 | 0.511 | 0.476 | 0.41 | 0.562 | 0.463 | 0.49 | 0.554 | 0.415 | 0.416 | 0.509 | 0.547 | 0.523 | 0.508 | 0.499 | 0.499 | 0.635 | 0.503 | 0.504 | 0.504 | 0.525 | 0.587 | 0.535 | 0.632 | 0.517 | 0.539 | 0.554 | 0.502 | 0.477 | 0.574 | 0.567 | 0.587 | 0.525 | 0.554 | 0.539 | 0.411 | 0.553 | 0.537 | 0.545 | 0.533 | 0.42 | 0.614 | 0.502 | 0.574 | 0.472 | 0.52 | 0.524 | 0.49 | 0.545 | 0.393 | 0.431 | 0.528 | 0.55 | 0.522 | 0.495 | 0.541 | 0.493 | 0.535 | 0.464 | 0.575 | 0.432 | 0.483 | 0.489 | 0.559 | 0.56 | 0.412 | 0.545 | 0.572 | 0.428 | 0.671 | 0.511 | 0.536 | 0.535 | 0.655 | 0.49 | 0.519 | 0.542 | 0.496 | 0.469 | 0.573 | 0.616 | 0.561 | 0.596 | 0.408 | 0.496 | 0.471 | 0.528 | 0.474 | 0.53 | 0.531 | 0.526 | 0.527 | 0.529 | 0.555 | 0.477 | 0.589 | 0.473 | 0.558 | 0.659 | 0.536 | 0.527 | 0.504 | 0.535 | 0.48 | 0.423 | 0.525 | 0.547 | 0.473 | 0.4 | 0.544 | 0.444 | 0.504 | 0.547 | 0.626 | 0.435 | 0.568 | 0.512 | 0.554 | 0.527 | 0.492 | 0.51 | 0.535 | 0.585 | 0.472 | 0.571 | 0.571 | 0.487 | 0.423 | 0.411 | 0.497 | 0.475 | 0.406 | 0.479 | 0.579 | 0.556 | 0.565 | 0.499 | 0.544 | 0.54 | 0.511 | 0.583 | 0.68 | 0.499 | 0.54 | 0.541 | 0.494 | 0.472 | 0.423 | 0.571 | 0.496 | 0.589 | 0.578 | 0.553 | 0.545 | 0.619 | 0.559 | 0.515 | 0.552 | 0.521 | 0.568 | 0.551 | 0.551 | 0.416 | 0.593 | 0.505 | 0.473 | 0.519 | 0.508 | 0.568 | 0.476 | 0.631 | 0.577 |